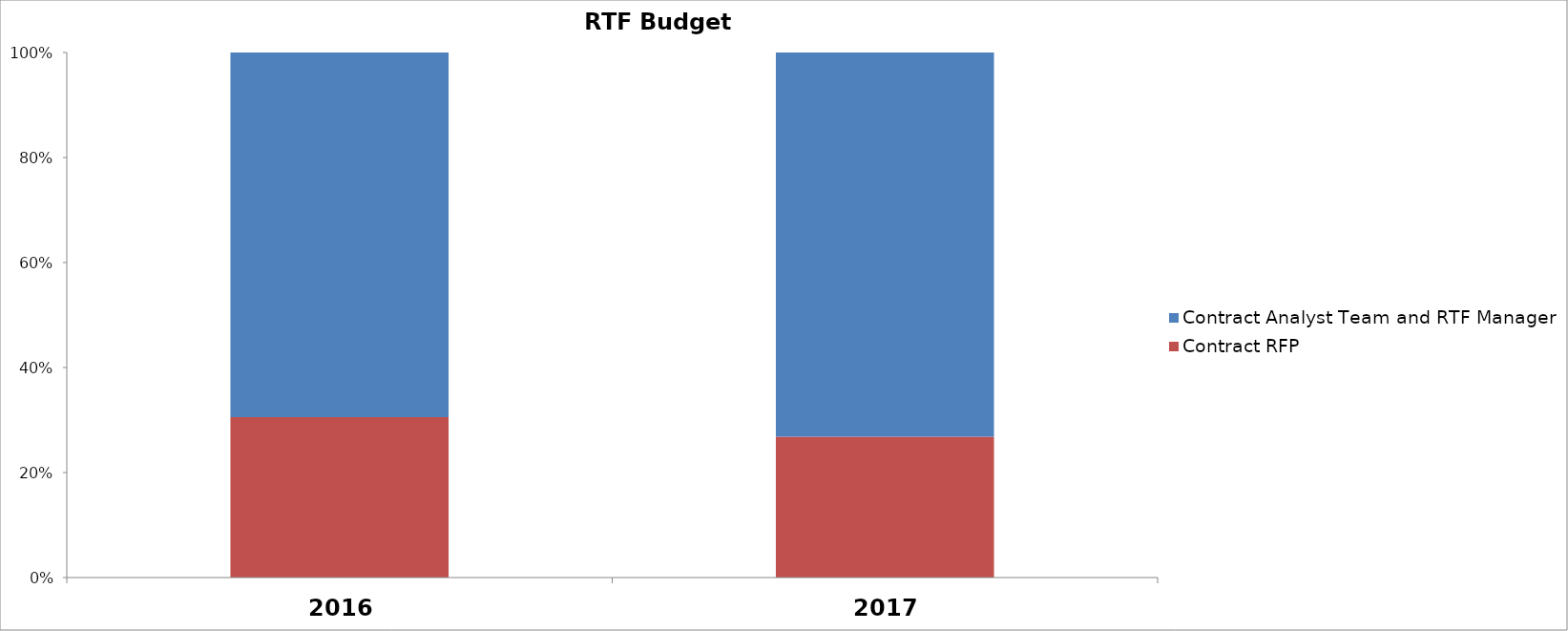
| Category | Contract RFP | Contract Analyst Team and RTF Manager |
|---|---|---|
| 2016.0 | 508000 | 1155000 |
| 2017.0 | 480300 | 1309500 |